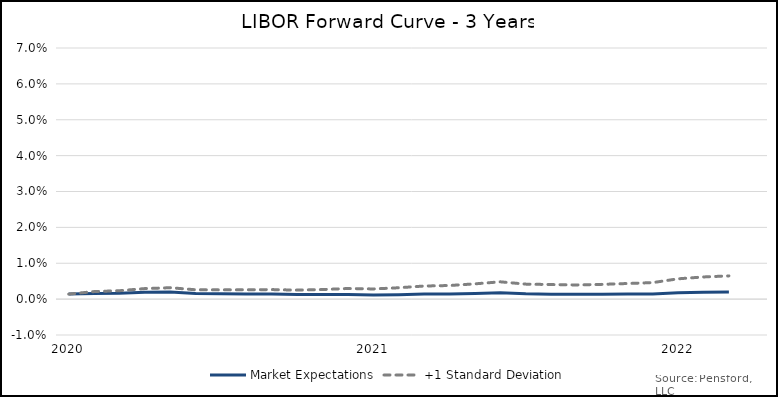
| Category | Market Expectations | +1 Standard Deviation |
|---|---|---|
| 2020-10-30 | 0.001 | 0.001 |
| 2020-11-30 | 0.002 | 0.002 |
| 2020-12-30 | 0.002 | 0.002 |
| 2021-01-30 | 0.002 | 0.003 |
| 2021-02-28 | 0.002 | 0.003 |
| 2021-03-28 | 0.002 | 0.003 |
| 2021-04-28 | 0.001 | 0.003 |
| 2021-05-28 | 0.001 | 0.003 |
| 2021-06-28 | 0.001 | 0.003 |
| 2021-07-28 | 0.001 | 0.003 |
| 2021-08-28 | 0.001 | 0.003 |
| 2021-09-28 | 0.001 | 0.003 |
| 2021-10-28 | 0.001 | 0.003 |
| 2021-11-28 | 0.001 | 0.003 |
| 2021-12-28 | 0.001 | 0.004 |
| 2022-01-28 | 0.001 | 0.004 |
| 2022-02-28 | 0.002 | 0.004 |
| 2022-03-28 | 0.002 | 0.005 |
| 2022-04-28 | 0.001 | 0.004 |
| 2022-05-28 | 0.001 | 0.004 |
| 2022-06-28 | 0.001 | 0.004 |
| 2022-07-28 | 0.001 | 0.004 |
| 2022-08-28 | 0.001 | 0.004 |
| 2022-09-28 | 0.001 | 0.005 |
| 2022-10-28 | 0.002 | 0.006 |
| 2022-11-28 | 0.002 | 0.006 |
| 2022-12-28 | 0.002 | 0.006 |
| 2023-01-28 | 0.002 | 0.007 |
| 2023-02-28 | 0.002 | 0.007 |
| 2023-03-28 | 0.002 | 0.007 |
| 2023-04-28 | 0.002 | 0.008 |
| 2023-05-28 | 0.002 | 0.008 |
| 2023-06-28 | 0.002 | 0.008 |
| 2023-07-28 | 0.002 | 0.009 |
| 2023-08-28 | 0.002 | 0.009 |
| 2023-09-28 | 0.003 | 0.009 |
| 2023-10-28 | 0.003 | 0.011 |
| 2023-11-28 | 0.004 | 0.012 |
| 2023-12-28 | 0.004 | 0.012 |
| 2024-01-28 | 0.004 | 0.012 |
| 2024-02-28 | 0.004 | 0.013 |
| 2024-03-28 | 0.004 | 0.013 |
| 2024-04-28 | 0.004 | 0.014 |
| 2024-05-28 | 0.004 | 0.014 |
| 2024-06-28 | 0.004 | 0.015 |
| 2024-07-28 | 0.004 | 0.015 |
| 2024-08-28 | 0.005 | 0.015 |
| 2024-09-28 | 0.005 | 0.015 |
| 2024-10-28 | 0.005 | 0.016 |
| 2024-11-28 | 0.006 | 0.016 |
| 2024-12-28 | 0.006 | 0.017 |
| 2025-01-28 | 0.006 | 0.017 |
| 2025-02-28 | 0.006 | 0.018 |
| 2025-03-28 | 0.006 | 0.018 |
| 2025-04-28 | 0.006 | 0.019 |
| 2025-05-28 | 0.007 | 0.019 |
| 2025-06-28 | 0.007 | 0.02 |
| 2025-07-28 | 0.007 | 0.02 |
| 2025-08-28 | 0.007 | 0.021 |
| 2025-09-28 | 0.007 | 0.021 |
| 2025-10-28 | 0.008 | 0.022 |
| 2025-11-28 | 0.008 | 0.023 |
| 2025-12-28 | 0.008 | 0.023 |
| 2026-01-28 | 0.008 | 0.024 |
| 2026-02-28 | 0.008 | 0.025 |
| 2026-03-28 | 0.008 | 0.025 |
| 2026-04-28 | 0.009 | 0.026 |
| 2026-05-28 | 0.009 | 0.026 |
| 2026-06-28 | 0.009 | 0.027 |
| 2026-07-28 | 0.009 | 0.027 |
| 2026-08-28 | 0.009 | 0.026 |
| 2026-09-28 | 0.009 | 0.025 |
| 2026-10-28 | 0.009 | 0.024 |
| 2026-11-28 | 0.01 | 0.024 |
| 2026-12-28 | 0.01 | 0.025 |
| 2027-01-28 | 0.01 | 0.025 |
| 2027-02-28 | 0.01 | 0.026 |
| 2027-03-28 | 0.01 | 0.026 |
| 2027-04-28 | 0.01 | 0.027 |
| 2027-05-28 | 0.01 | 0.027 |
| 2027-06-28 | 0.011 | 0.027 |
| 2027-07-28 | 0.011 | 0.028 |
| 2027-08-28 | 0.011 | 0.03 |
| 2027-09-28 | 0.011 | 0.032 |
| 2027-10-28 | 0.011 | 0.034 |
| 2027-11-28 | 0.011 | 0.034 |
| 2027-12-28 | 0.011 | 0.035 |
| 2028-01-28 | 0.011 | 0.035 |
| 2028-02-28 | 0.011 | 0.036 |
| 2028-03-28 | 0.012 | 0.036 |
| 2028-04-28 | 0.012 | 0.037 |
| 2028-05-28 | 0.012 | 0.037 |
| 2028-06-28 | 0.012 | 0.038 |
| 2028-07-28 | 0.012 | 0.039 |
| 2028-08-28 | 0.012 | 0.039 |
| 2028-09-28 | 0.012 | 0.039 |
| 2028-10-28 | 0.012 | 0.039 |
| 2028-11-28 | 0.012 | 0.039 |
| 2028-12-28 | 0.012 | 0.04 |
| 2029-01-28 | 0.012 | 0.04 |
| 2029-02-28 | 0.013 | 0.041 |
| 2029-03-28 | 0.013 | 0.041 |
| 2029-04-28 | 0.013 | 0.042 |
| 2029-05-28 | 0.013 | 0.042 |
| 2029-06-28 | 0.013 | 0.043 |
| 2029-07-28 | 0.013 | 0.043 |
| 2029-08-28 | 0.013 | 0.038 |
| 2029-09-28 | 0.013 | 0.032 |
| 2029-10-28 | 0.013 | 0.026 |
| 2029-11-28 | 0.013 | 0.025 |
| 2029-12-28 | 0.013 | 0.026 |
| 2030-01-28 | 0.013 | 0.026 |
| 2030-02-28 | 0.014 | 0.026 |
| 2030-03-28 | 0.014 | 0.026 |
| 2030-04-28 | 0.014 | 0.027 |
| 2030-05-28 | 0.014 | 0.027 |
| 2030-06-28 | 0.014 | 0.027 |
| 2030-07-28 | 0.014 | 0.027 |
| 2030-08-28 | 0.014 | 0.031 |
| 2030-09-28 | 0.014 | 0.036 |